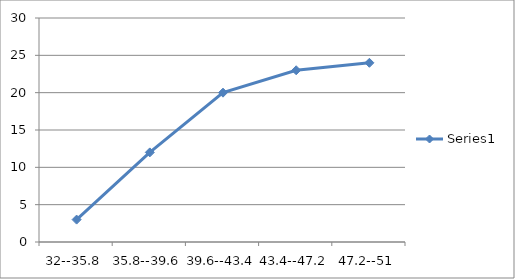
| Category | Series 0 |
|---|---|
| 32--35.8 | 3 |
| 35.8--39.6 | 12 |
| 39.6--43.4 | 20 |
| 43.4--47.2 | 23 |
| 47.2--51 | 24 |